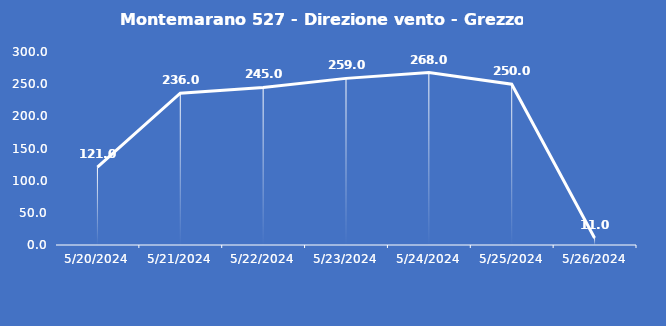
| Category | Montemarano 527 - Direzione vento - Grezzo (°N) |
|---|---|
| 5/20/24 | 121 |
| 5/21/24 | 236 |
| 5/22/24 | 245 |
| 5/23/24 | 259 |
| 5/24/24 | 268 |
| 5/25/24 | 250 |
| 5/26/24 | 11 |